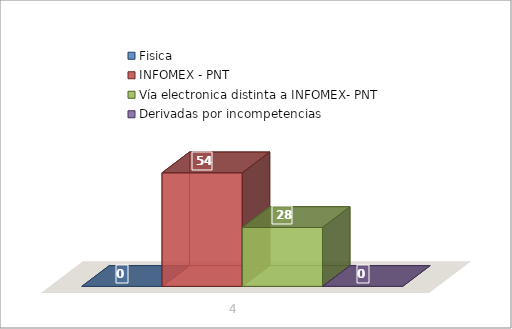
| Category | Fisica | INFOMEX - PNT | Vía electronica distinta a INFOMEX- PNT | Derivadas por incompetencias |
|---|---|---|---|---|
| 0 | 0 | 54 | 28 | 0 |